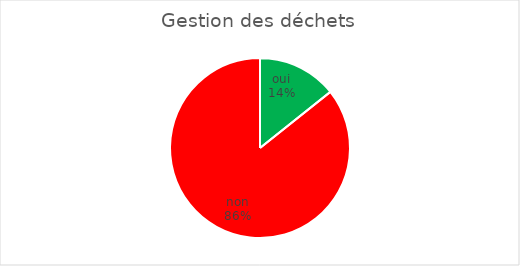
| Category | Gestion des déchets |
|---|---|
| oui | 1 |
| non | 6 |